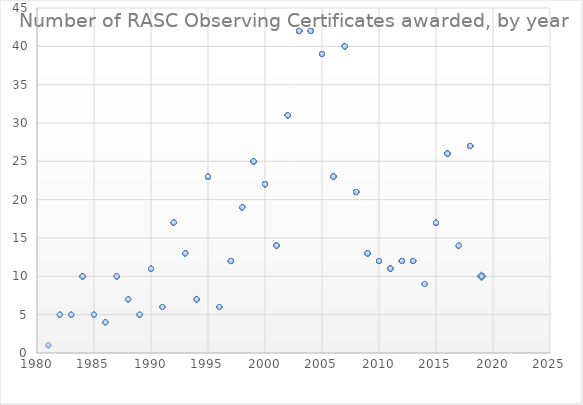
| Category | Series 0 |
|---|---|
| 2019.0 | 10 |
| 2019.0 | 10 |
| 2019.0 | 10 |
| 2019.0 | 10 |
| 2019.0 | 10 |
| 2019.0 | 10 |
| 2019.0 | 10 |
| 2019.0 | 10 |
| 2019.0 | 10 |
| 2018.0 | 27 |
| 2018.0 | 27 |
| 2018.0 | 27 |
| 2018.0 | 27 |
| 2018.0 | 27 |
| 2018.0 | 27 |
| 2018.0 | 27 |
| 2018.0 | 27 |
| 2018.0 | 27 |
| 2018.0 | 27 |
| 2018.0 | 27 |
| 2018.0 | 27 |
| 2018.0 | 27 |
| 2018.0 | 27 |
| 2018.0 | 27 |
| 2018.0 | 27 |
| 2018.0 | 27 |
| 2018.0 | 27 |
| 2018.0 | 27 |
| 2018.0 | 27 |
| 2018.0 | 27 |
| 2018.0 | 27 |
| 2018.0 | 27 |
| 2018.0 | 27 |
| 2018.0 | 27 |
| 2018.0 | 27 |
| 2018.0 | 27 |
| 2017.0 | 14 |
| 2017.0 | 14 |
| 2017.0 | 14 |
| 2017.0 | 14 |
| 2017.0 | 14 |
| 2017.0 | 14 |
| 2017.0 | 14 |
| 2017.0 | 14 |
| 2017.0 | 14 |
| 2017.0 | 14 |
| 2017.0 | 14 |
| 2017.0 | 14 |
| 2017.0 | 14 |
| 2017.0 | 14 |
| 2016.0 | 26 |
| 2016.0 | 26 |
| 2016.0 | 26 |
| 2016.0 | 26 |
| 2016.0 | 26 |
| 2016.0 | 26 |
| 2016.0 | 26 |
| 2016.0 | 26 |
| 2016.0 | 26 |
| 2016.0 | 26 |
| 2016.0 | 26 |
| 2016.0 | 26 |
| 2016.0 | 26 |
| 2016.0 | 26 |
| 2016.0 | 26 |
| 2016.0 | 26 |
| 2016.0 | 26 |
| 2016.0 | 26 |
| 2016.0 | 26 |
| 2016.0 | 26 |
| 2016.0 | 26 |
| 2016.0 | 26 |
| 2016.0 | 26 |
| 2016.0 | 26 |
| 2016.0 | 26 |
| 2016.0 | 26 |
| 2015.0 | 17 |
| 2015.0 | 17 |
| 2015.0 | 17 |
| 2015.0 | 17 |
| 2015.0 | 17 |
| 2015.0 | 17 |
| 2015.0 | 17 |
| 2015.0 | 17 |
| 2015.0 | 17 |
| 2015.0 | 17 |
| 2015.0 | 17 |
| 2015.0 | 17 |
| 2015.0 | 17 |
| 2015.0 | 17 |
| 2015.0 | 17 |
| 2015.0 | 17 |
| 2015.0 | 17 |
| 2014.0 | 9 |
| 2014.0 | 9 |
| 2014.0 | 9 |
| 2014.0 | 9 |
| 2014.0 | 9 |
| 2014.0 | 9 |
| 2014.0 | 9 |
| 2014.0 | 9 |
| 2014.0 | 9 |
| 2013.0 | 12 |
| 2013.0 | 12 |
| 2013.0 | 12 |
| 2013.0 | 12 |
| 2013.0 | 12 |
| 2013.0 | 12 |
| 2013.0 | 12 |
| 2013.0 | 12 |
| 2013.0 | 12 |
| 2013.0 | 12 |
| 2013.0 | 12 |
| 2013.0 | 12 |
| 2012.0 | 12 |
| 2012.0 | 12 |
| 2012.0 | 12 |
| 2012.0 | 12 |
| 2012.0 | 12 |
| 2012.0 | 12 |
| 2012.0 | 12 |
| 2012.0 | 12 |
| 2012.0 | 12 |
| 2012.0 | 12 |
| 2012.0 | 12 |
| 2012.0 | 12 |
| 2011.0 | 11 |
| 2011.0 | 11 |
| 2011.0 | 11 |
| 2011.0 | 11 |
| 2011.0 | 11 |
| 2011.0 | 11 |
| 2011.0 | 11 |
| 2011.0 | 11 |
| 2011.0 | 11 |
| 2011.0 | 11 |
| 2011.0 | 11 |
| 2010.0 | 12 |
| 2010.0 | 12 |
| 2010.0 | 12 |
| 2010.0 | 12 |
| 2010.0 | 12 |
| 2010.0 | 12 |
| 2010.0 | 12 |
| 2010.0 | 12 |
| 2010.0 | 12 |
| 2010.0 | 12 |
| 2010.0 | 12 |
| 2010.0 | 12 |
| 2009.0 | 13 |
| 2009.0 | 13 |
| 2009.0 | 13 |
| 2009.0 | 13 |
| 2009.0 | 13 |
| 2009.0 | 13 |
| 2009.0 | 13 |
| 2009.0 | 13 |
| 2009.0 | 13 |
| 2009.0 | 13 |
| 2009.0 | 13 |
| 2009.0 | 13 |
| 2009.0 | 13 |
| 2008.0 | 21 |
| 2008.0 | 21 |
| 2008.0 | 21 |
| 2008.0 | 21 |
| 2008.0 | 21 |
| 2008.0 | 21 |
| 2008.0 | 21 |
| 2008.0 | 21 |
| 2008.0 | 21 |
| 2008.0 | 21 |
| 2008.0 | 21 |
| 2008.0 | 21 |
| 2008.0 | 21 |
| 2008.0 | 21 |
| 2008.0 | 21 |
| 2008.0 | 21 |
| 2008.0 | 21 |
| 2008.0 | 21 |
| 2008.0 | 21 |
| 2008.0 | 21 |
| 2008.0 | 21 |
| 2007.0 | 40 |
| 2007.0 | 40 |
| 2007.0 | 40 |
| 2007.0 | 40 |
| 2007.0 | 40 |
| 2007.0 | 40 |
| 2007.0 | 40 |
| 2007.0 | 40 |
| 2007.0 | 40 |
| 2007.0 | 40 |
| 2007.0 | 40 |
| 2007.0 | 40 |
| 2007.0 | 40 |
| 2007.0 | 40 |
| 2007.0 | 40 |
| 2007.0 | 40 |
| 2007.0 | 40 |
| 2007.0 | 40 |
| 2007.0 | 40 |
| 2007.0 | 40 |
| 2007.0 | 40 |
| 2007.0 | 40 |
| 2007.0 | 40 |
| 2007.0 | 40 |
| 2007.0 | 40 |
| 2007.0 | 40 |
| 2007.0 | 40 |
| 2007.0 | 40 |
| 2007.0 | 40 |
| 2007.0 | 40 |
| 2007.0 | 40 |
| 2007.0 | 40 |
| 2007.0 | 40 |
| 2007.0 | 40 |
| 2007.0 | 40 |
| 2007.0 | 40 |
| 2007.0 | 40 |
| 2007.0 | 40 |
| 2007.0 | 40 |
| 2007.0 | 40 |
| 2006.0 | 23 |
| 2006.0 | 23 |
| 2006.0 | 23 |
| 2006.0 | 23 |
| 2006.0 | 23 |
| 2006.0 | 23 |
| 2006.0 | 23 |
| 2006.0 | 23 |
| 2006.0 | 23 |
| 2006.0 | 23 |
| 2006.0 | 23 |
| 2006.0 | 23 |
| 2006.0 | 23 |
| 2006.0 | 23 |
| 2006.0 | 23 |
| 2006.0 | 23 |
| 2006.0 | 23 |
| 2006.0 | 23 |
| 2006.0 | 23 |
| 2006.0 | 23 |
| 2006.0 | 23 |
| 2006.0 | 23 |
| 2006.0 | 23 |
| 2005.0 | 39 |
| 2005.0 | 39 |
| 2005.0 | 39 |
| 2005.0 | 39 |
| 2005.0 | 39 |
| 2005.0 | 39 |
| 2005.0 | 39 |
| 2005.0 | 39 |
| 2005.0 | 39 |
| 2005.0 | 39 |
| 2005.0 | 39 |
| 2005.0 | 39 |
| 2005.0 | 39 |
| 2005.0 | 39 |
| 2005.0 | 39 |
| 2005.0 | 39 |
| 2005.0 | 39 |
| 2005.0 | 39 |
| 2005.0 | 39 |
| 2005.0 | 39 |
| 2005.0 | 39 |
| 2005.0 | 39 |
| 2005.0 | 39 |
| 2005.0 | 39 |
| 2005.0 | 39 |
| 2005.0 | 39 |
| 2005.0 | 39 |
| 2005.0 | 39 |
| 2005.0 | 39 |
| 2005.0 | 39 |
| 2005.0 | 39 |
| 2005.0 | 39 |
| 2005.0 | 39 |
| 2005.0 | 39 |
| 2005.0 | 39 |
| 2005.0 | 39 |
| 2005.0 | 39 |
| 2005.0 | 39 |
| 2005.0 | 39 |
| 2004.0 | 42 |
| 2004.0 | 42 |
| 2004.0 | 42 |
| 2004.0 | 42 |
| 2004.0 | 42 |
| 2004.0 | 42 |
| 2004.0 | 42 |
| 2004.0 | 42 |
| 2004.0 | 42 |
| 2004.0 | 42 |
| 2004.0 | 42 |
| 2004.0 | 42 |
| 2004.0 | 42 |
| 2004.0 | 42 |
| 2004.0 | 42 |
| 2004.0 | 42 |
| 2004.0 | 42 |
| 2004.0 | 42 |
| 2004.0 | 42 |
| 2004.0 | 42 |
| 2004.0 | 42 |
| 2004.0 | 42 |
| 2004.0 | 42 |
| 2004.0 | 42 |
| 2004.0 | 42 |
| 2004.0 | 42 |
| 2004.0 | 42 |
| 2004.0 | 42 |
| 2004.0 | 42 |
| 2004.0 | 42 |
| 2004.0 | 42 |
| 2004.0 | 42 |
| 2004.0 | 42 |
| 2004.0 | 42 |
| 2004.0 | 42 |
| 2004.0 | 42 |
| 2004.0 | 42 |
| 2004.0 | 42 |
| 2004.0 | 42 |
| 2004.0 | 42 |
| 2004.0 | 42 |
| 2004.0 | 42 |
| 2003.0 | 42 |
| 2003.0 | 42 |
| 2003.0 | 42 |
| 2003.0 | 42 |
| 2003.0 | 42 |
| 2003.0 | 42 |
| 2003.0 | 42 |
| 2003.0 | 42 |
| 2003.0 | 42 |
| 2003.0 | 42 |
| 2003.0 | 42 |
| 2003.0 | 42 |
| 2003.0 | 42 |
| 2003.0 | 42 |
| 2003.0 | 42 |
| 2003.0 | 42 |
| 2003.0 | 42 |
| 2003.0 | 42 |
| 2003.0 | 42 |
| 2003.0 | 42 |
| 2003.0 | 42 |
| 2003.0 | 42 |
| 2003.0 | 42 |
| 2003.0 | 42 |
| 2003.0 | 42 |
| 2003.0 | 42 |
| 2003.0 | 42 |
| 2003.0 | 42 |
| 2003.0 | 42 |
| 2003.0 | 42 |
| 2003.0 | 42 |
| 2003.0 | 42 |
| 2003.0 | 42 |
| 2003.0 | 42 |
| 2003.0 | 42 |
| 2003.0 | 42 |
| 2003.0 | 42 |
| 2003.0 | 42 |
| 2003.0 | 42 |
| 2003.0 | 42 |
| 2003.0 | 42 |
| 2003.0 | 42 |
| 2002.0 | 31 |
| 2002.0 | 31 |
| 2002.0 | 31 |
| 2002.0 | 31 |
| 2002.0 | 31 |
| 2002.0 | 31 |
| 2002.0 | 31 |
| 2002.0 | 31 |
| 2002.0 | 31 |
| 2002.0 | 31 |
| 2002.0 | 31 |
| 2002.0 | 31 |
| 2002.0 | 31 |
| 2002.0 | 31 |
| 2002.0 | 31 |
| 2002.0 | 31 |
| 2002.0 | 31 |
| 2002.0 | 31 |
| 2002.0 | 31 |
| 2002.0 | 31 |
| 2002.0 | 31 |
| 2002.0 | 31 |
| 2002.0 | 31 |
| 2002.0 | 31 |
| 2002.0 | 31 |
| 2002.0 | 31 |
| 2002.0 | 31 |
| 2002.0 | 31 |
| 2002.0 | 31 |
| 2002.0 | 31 |
| 2002.0 | 31 |
| 2001.0 | 14 |
| 2001.0 | 14 |
| 2001.0 | 14 |
| 2001.0 | 14 |
| 2001.0 | 14 |
| 2001.0 | 14 |
| 2001.0 | 14 |
| 2001.0 | 14 |
| 2001.0 | 14 |
| 2001.0 | 14 |
| 2001.0 | 14 |
| 2001.0 | 14 |
| 2001.0 | 14 |
| 2001.0 | 14 |
| 2000.0 | 22 |
| 2000.0 | 22 |
| 2000.0 | 22 |
| 2000.0 | 22 |
| 2000.0 | 22 |
| 2000.0 | 22 |
| 2000.0 | 22 |
| 2000.0 | 22 |
| 2000.0 | 22 |
| 2000.0 | 22 |
| 2000.0 | 22 |
| 2000.0 | 22 |
| 2000.0 | 22 |
| 2000.0 | 22 |
| 2000.0 | 22 |
| 2000.0 | 22 |
| 2000.0 | 22 |
| 2000.0 | 22 |
| 2000.0 | 22 |
| 2000.0 | 22 |
| 2000.0 | 22 |
| 2000.0 | 22 |
| 1999.0 | 25 |
| 1999.0 | 25 |
| 1999.0 | 25 |
| 1999.0 | 25 |
| 1999.0 | 25 |
| 1999.0 | 25 |
| 1999.0 | 25 |
| 1999.0 | 25 |
| 1999.0 | 25 |
| 1999.0 | 25 |
| 1999.0 | 25 |
| 1999.0 | 25 |
| 1999.0 | 25 |
| 1999.0 | 25 |
| 1999.0 | 25 |
| 1999.0 | 25 |
| 1999.0 | 25 |
| 1999.0 | 25 |
| 1999.0 | 25 |
| 1999.0 | 25 |
| 1999.0 | 25 |
| 1999.0 | 25 |
| 1999.0 | 25 |
| 1999.0 | 25 |
| 1999.0 | 25 |
| 1998.0 | 19 |
| 1998.0 | 19 |
| 1998.0 | 19 |
| 1998.0 | 19 |
| 1998.0 | 19 |
| 1998.0 | 19 |
| 1998.0 | 19 |
| 1998.0 | 19 |
| 1998.0 | 19 |
| 1998.0 | 19 |
| 1998.0 | 19 |
| 1998.0 | 19 |
| 1998.0 | 19 |
| 1998.0 | 19 |
| 1998.0 | 19 |
| 1998.0 | 19 |
| 1998.0 | 19 |
| 1998.0 | 19 |
| 1998.0 | 19 |
| 1997.0 | 12 |
| 1997.0 | 12 |
| 1997.0 | 12 |
| 1997.0 | 12 |
| 1997.0 | 12 |
| 1997.0 | 12 |
| 1997.0 | 12 |
| 1997.0 | 12 |
| 1997.0 | 12 |
| 1997.0 | 12 |
| 1997.0 | 12 |
| 1997.0 | 12 |
| 1996.0 | 6 |
| 1996.0 | 6 |
| 1996.0 | 6 |
| 1996.0 | 6 |
| 1996.0 | 6 |
| 1996.0 | 6 |
| 1995.0 | 23 |
| 1995.0 | 23 |
| 1995.0 | 23 |
| 1995.0 | 23 |
| 1995.0 | 23 |
| 1995.0 | 23 |
| 1995.0 | 23 |
| 1995.0 | 23 |
| 1995.0 | 23 |
| 1995.0 | 23 |
| 1995.0 | 23 |
| 1995.0 | 23 |
| 1995.0 | 23 |
| 1995.0 | 23 |
| 1995.0 | 23 |
| 1995.0 | 23 |
| 1995.0 | 23 |
| 1995.0 | 23 |
| 1995.0 | 23 |
| 1995.0 | 23 |
| 1995.0 | 23 |
| 1995.0 | 23 |
| 1995.0 | 23 |
| 1994.0 | 7 |
| 1994.0 | 7 |
| 1994.0 | 7 |
| 1994.0 | 7 |
| 1994.0 | 7 |
| 1994.0 | 7 |
| 1994.0 | 7 |
| 1993.0 | 13 |
| 1993.0 | 13 |
| 1993.0 | 13 |
| 1993.0 | 13 |
| 1993.0 | 13 |
| 1993.0 | 13 |
| 1993.0 | 13 |
| 1993.0 | 13 |
| 1993.0 | 13 |
| 1993.0 | 13 |
| 1993.0 | 13 |
| 1993.0 | 13 |
| 1993.0 | 13 |
| 1992.0 | 17 |
| 1992.0 | 17 |
| 1992.0 | 17 |
| 1992.0 | 17 |
| 1992.0 | 17 |
| 1992.0 | 17 |
| 1992.0 | 17 |
| 1992.0 | 17 |
| 1992.0 | 17 |
| 1992.0 | 17 |
| 1992.0 | 17 |
| 1992.0 | 17 |
| 1992.0 | 17 |
| 1992.0 | 17 |
| 1992.0 | 17 |
| 1992.0 | 17 |
| 1992.0 | 17 |
| 1991.0 | 6 |
| 1991.0 | 6 |
| 1991.0 | 6 |
| 1991.0 | 6 |
| 1991.0 | 6 |
| 1991.0 | 6 |
| 1990.0 | 11 |
| 1990.0 | 11 |
| 1990.0 | 11 |
| 1990.0 | 11 |
| 1990.0 | 11 |
| 1990.0 | 11 |
| 1990.0 | 11 |
| 1990.0 | 11 |
| 1990.0 | 11 |
| 1990.0 | 11 |
| 1990.0 | 11 |
| 1989.0 | 5 |
| 1989.0 | 5 |
| 1989.0 | 5 |
| 1989.0 | 5 |
| 1989.0 | 5 |
| 1988.0 | 7 |
| 1988.0 | 7 |
| 1988.0 | 7 |
| 1988.0 | 7 |
| 1988.0 | 7 |
| 1988.0 | 7 |
| 1988.0 | 7 |
| 1987.0 | 10 |
| 1987.0 | 10 |
| 1987.0 | 10 |
| 1987.0 | 10 |
| 1987.0 | 10 |
| 1987.0 | 10 |
| 1987.0 | 10 |
| 1987.0 | 10 |
| 1987.0 | 10 |
| 1987.0 | 10 |
| 1986.0 | 4 |
| 1986.0 | 4 |
| 1986.0 | 4 |
| 1986.0 | 4 |
| 1985.0 | 5 |
| 1985.0 | 5 |
| 1985.0 | 5 |
| 1985.0 | 5 |
| 1985.0 | 5 |
| 1984.0 | 10 |
| 1984.0 | 10 |
| 1984.0 | 10 |
| 1984.0 | 10 |
| 1984.0 | 10 |
| 1984.0 | 10 |
| 1984.0 | 10 |
| 1984.0 | 10 |
| 1984.0 | 10 |
| 1984.0 | 10 |
| 1983.0 | 5 |
| 1983.0 | 5 |
| 1983.0 | 5 |
| 1983.0 | 5 |
| 1983.0 | 5 |
| 1982.0 | 5 |
| 1982.0 | 5 |
| 1982.0 | 5 |
| 1982.0 | 5 |
| 1982.0 | 5 |
| 1981.0 | 1 |